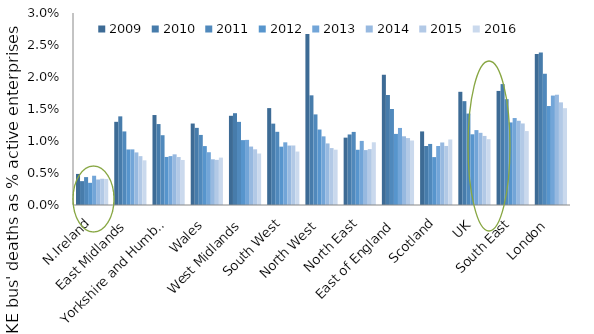
| Category | 2009 | 2010 | 2011 | 2012 | 2013 | 2014 | 2015 | 2016 |
|---|---|---|---|---|---|---|---|---|
| N.Ireland | 0.005 | 0.004 | 0.004 | 0.003 | 0.005 | 0.004 | 0.004 | 0.004 |
| East Midlands | 0.013 | 0.014 | 0.011 | 0.009 | 0.009 | 0.008 | 0.008 | 0.007 |
| Yorkshire and Humber | 0.014 | 0.013 | 0.011 | 0.008 | 0.008 | 0.008 | 0.007 | 0.007 |
| Wales | 0.013 | 0.012 | 0.011 | 0.009 | 0.008 | 0.007 | 0.007 | 0.007 |
| West Midlands | 0.014 | 0.014 | 0.013 | 0.01 | 0.01 | 0.009 | 0.009 | 0.008 |
| South West | 0.015 | 0.013 | 0.011 | 0.009 | 0.01 | 0.009 | 0.009 | 0.008 |
| North West | 0.027 | 0.017 | 0.014 | 0.012 | 0.011 | 0.01 | 0.009 | 0.009 |
| North East | 0.011 | 0.011 | 0.011 | 0.009 | 0.01 | 0.009 | 0.009 | 0.01 |
| East of England | 0.02 | 0.017 | 0.015 | 0.011 | 0.012 | 0.011 | 0.01 | 0.01 |
| Scotland | 0.011 | 0.009 | 0.01 | 0.007 | 0.009 | 0.01 | 0.009 | 0.01 |
| UK | 0.018 | 0.016 | 0.014 | 0.011 | 0.012 | 0.011 | 0.011 | 0.01 |
| South East | 0.018 | 0.019 | 0.017 | 0.013 | 0.014 | 0.013 | 0.013 | 0.012 |
| London | 0.024 | 0.024 | 0.02 | 0.015 | 0.017 | 0.017 | 0.016 | 0.015 |